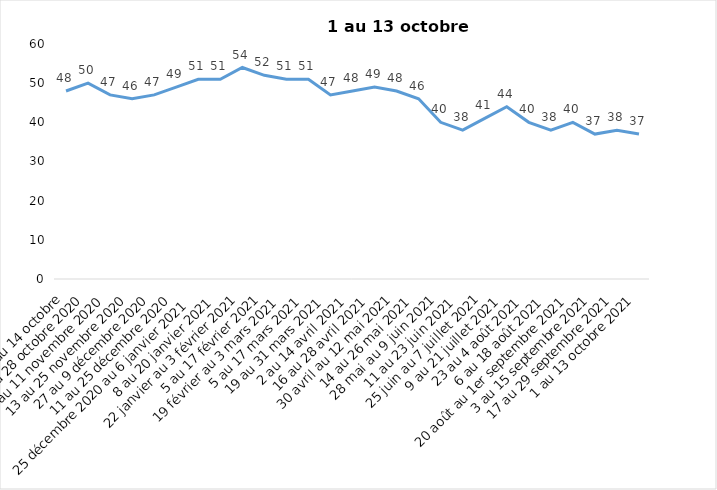
| Category | Toujours aux trois mesures |
|---|---|
| 2 au 14 octobre | 48 |
| 16 au 28 octobre 2020 | 50 |
| 30 octobre au 11 novembre 2020 | 47 |
| 13 au 25 novembre 2020 | 46 |
| 27 au 9 décembre 2020 | 47 |
| 11 au 25 décembre 2020 | 49 |
| 25 décembre 2020 au 6 janvier 2021 | 51 |
| 8 au 20 janvier 2021 | 51 |
| 22 janvier au 3 février 2021 | 54 |
| 5 au 17 février 2021 | 52 |
| 19 février au 3 mars 2021 | 51 |
| 5 au 17 mars 2021 | 51 |
| 19 au 31 mars 2021 | 47 |
| 2 au 14 avril 2021 | 48 |
| 16 au 28 avril 2021 | 49 |
| 30 avril au 12 mai 2021 | 48 |
| 14 au 26 mai 2021 | 46 |
| 28 mai au 9 juin 2021 | 40 |
| 11 au 23 juin 2021 | 38 |
| 25 juin au 7 juillet 2021 | 41 |
| 9 au 21 juillet 2021 | 44 |
| 23 au 4 août 2021 | 40 |
| 6 au 18 août 2021 | 38 |
| 20 août au 1er septembre 2021 | 40 |
| 3 au 15 septembre 2021 | 37 |
| 17 au 29 septembre 2021 | 38 |
| 1 au 13 octobre 2021 | 37 |